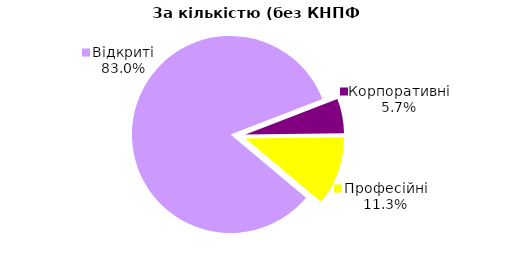
| Category | Series 0 |
|---|---|
| Відкриті | 44 |
| Корпоративні | 3 |
| Професійні | 6 |